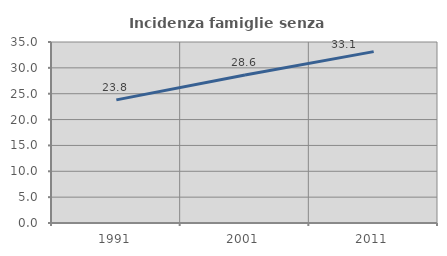
| Category | Incidenza famiglie senza nuclei |
|---|---|
| 1991.0 | 23.81 |
| 2001.0 | 28.621 |
| 2011.0 | 33.134 |